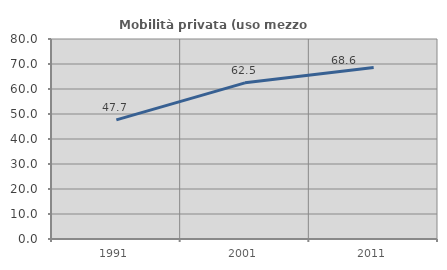
| Category | Mobilità privata (uso mezzo privato) |
|---|---|
| 1991.0 | 47.656 |
| 2001.0 | 62.456 |
| 2011.0 | 68.585 |